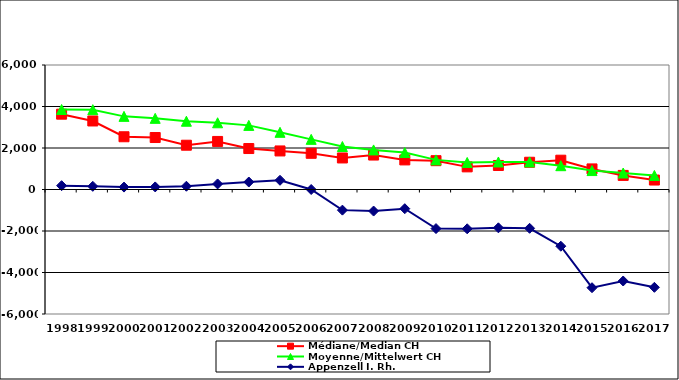
| Category | Médiane/Median CH | Moyenne/Mittelwert CH | Appenzell I. Rh. |
|---|---|---|---|
| 1998.0 | 3630 | 3856.13 | 185 |
| 1999.0 | 3302 | 3847.739 | 153 |
| 2000.0 | 2542 | 3524.64 | 116 |
| 2001.0 | 2505 | 3428.8 | 124 |
| 2002.0 | 2134 | 3290.4 | 157 |
| 2003.0 | 2316 | 3215.6 | 268 |
| 2004.0 | 1974 | 3090.325 | 360 |
| 2005.0 | 1858 | 2756.351 | 445 |
| 2006.0 | 1744.5 | 2416.426 | 0 |
| 2007.0 | 1520 | 2070.521 | -994 |
| 2008.0 | 1660 | 1907.634 | -1039 |
| 2009.0 | 1426 | 1780.53 | -925 |
| 2010.0 | 1388.8 | 1427.327 | -1884 |
| 2011.0 | 1091 | 1302.405 | -1894 |
| 2012.0 | 1157.645 | 1326.071 | -1847 |
| 2013.0 | 1313 | 1328.597 | -1870 |
| 2014.0 | 1412.435 | 1147.291 | -2733 |
| 2015.0 | 992 | 912.292 | -4733 |
| 2016.0 | 679 | 794.434 | -4410 |
| 2017.0 | 456.291 | 677.44 | -4714 |